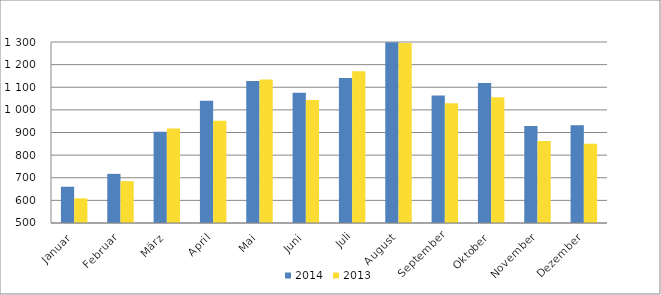
| Category | 2014 | 2013 |
|---|---|---|
| Januar | 660302 | 609221 |
| Februar | 717273 | 684879 |
| März | 902957 | 917650 |
| April | 1040794 | 951942 |
| Mai | 1128166 | 1133919 |
| Juni | 1075592 | 1043110 |
| Juli | 1140641 | 1170467 |
| August | 1298802 | 1295224 |
| September | 1063395 | 1028739 |
| Oktober | 1118560 | 1055314 |
| November | 929110 | 862235 |
| Dezember | 932562 | 850435 |